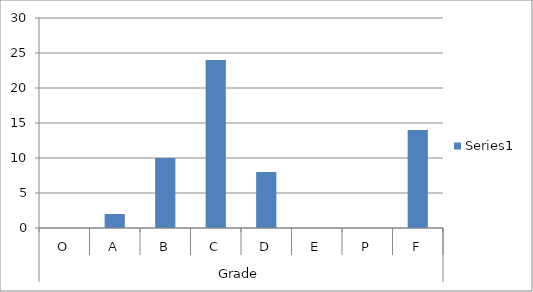
| Category | Series 0 |
|---|---|
| 0 | 0 |
| 1 | 2 |
| 2 | 10 |
| 3 | 24 |
| 4 | 8 |
| 5 | 0 |
| 6 | 0 |
| 7 | 14 |